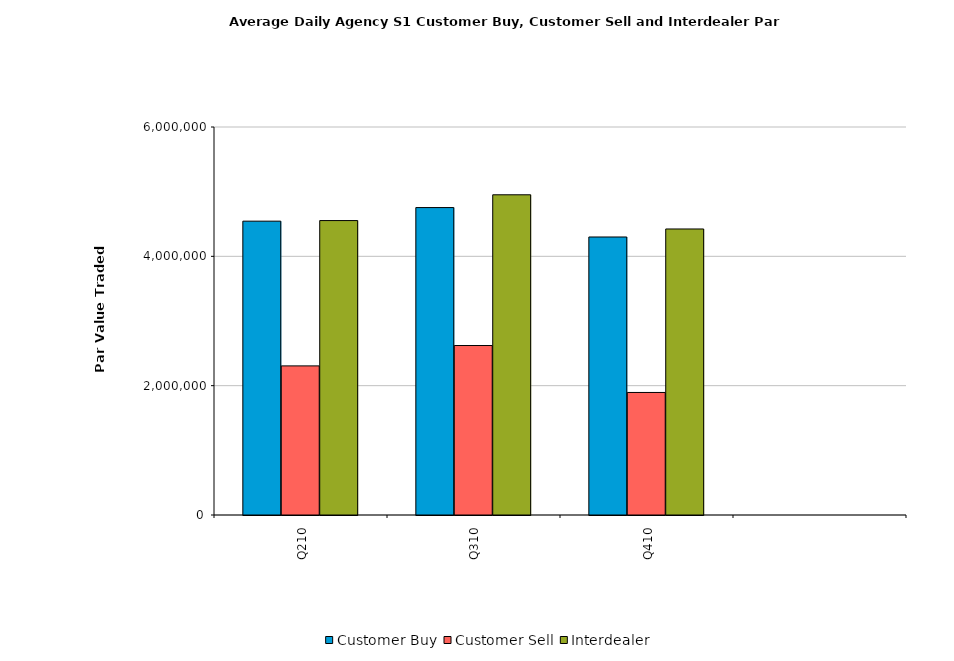
| Category | Customer Buy | Customer Sell | Interdealer |
|---|---|---|---|
| Q210 | 4543971.748 | 2305894.982 | 4553072.904 |
| Q310 | 4754031.558 | 2620680.99 | 4951733.425 |
| Q410 | 4298988.229 | 1895014.039 | 4422971.308 |